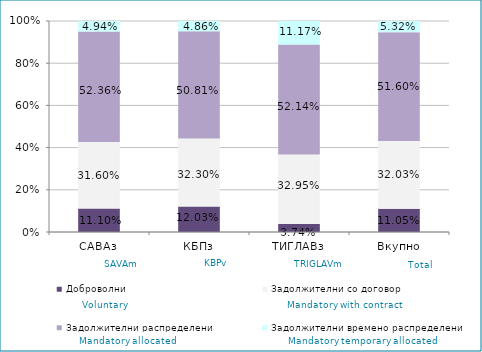
| Category | Доброволни  | Задолжителни со договор  | Задолжителни распределени  | Задолжителни времено распределени  |
|---|---|---|---|---|
| САВАз | 0.111 | 0.316 | 0.524 | 0.049 |
| КБПз | 0.12 | 0.323 | 0.508 | 0.049 |
| ТИГЛАВз | 0.037 | 0.33 | 0.521 | 0.112 |
| Вкупно | 0.111 | 0.32 | 0.516 | 0.053 |